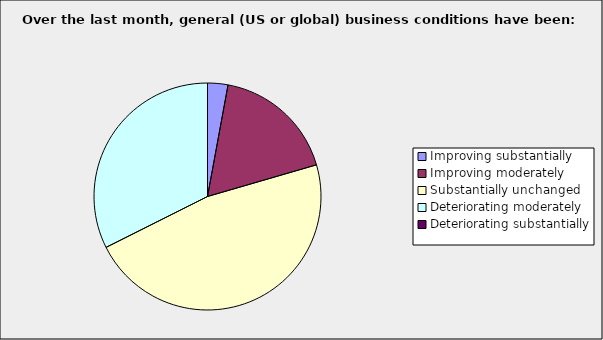
| Category | Series 0 |
|---|---|
| Improving substantially | 0.029 |
| Improving moderately | 0.176 |
| Substantially unchanged | 0.471 |
| Deteriorating moderately | 0.324 |
| Deteriorating substantially | 0 |